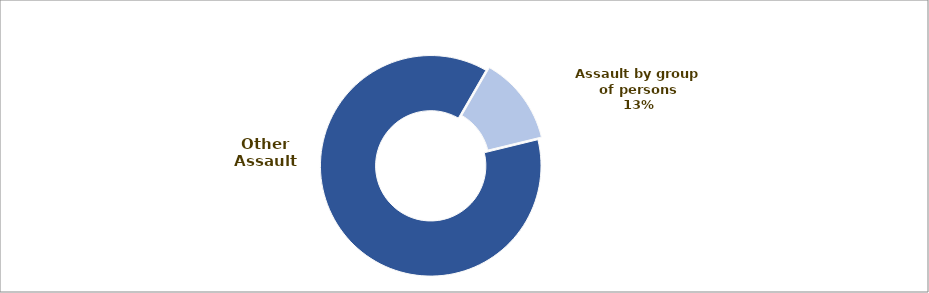
| Category | Series 0 |
|---|---|
| Assault by group of persons | 12.86 |
| Other Assault | 87.14 |